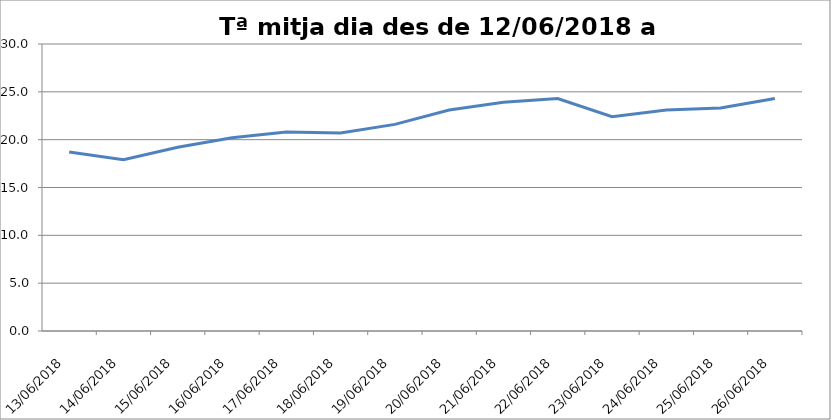
| Category | Tª mitja dia des de 12/06/2018 a 26/06/2018 |
|---|---|
| 13/06/2018 | 18.7 |
| 14/06/2018 | 17.9 |
| 15/06/2018 | 19.2 |
| 16/06/2018 | 20.2 |
| 17/06/2018 | 20.8 |
| 18/06/2018 | 20.7 |
| 19/06/2018 | 21.6 |
| 20/06/2018 | 23.1 |
| 21/06/2018 | 23.9 |
| 22/06/2018 | 24.3 |
| 23/06/2018 | 22.4 |
| 24/06/2018 | 23.1 |
| 25/06/2018 | 23.3 |
| 26/06/2018 | 24.3 |